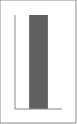
| Category | Series 1 |
|---|---|
| Point 1 | 1 |